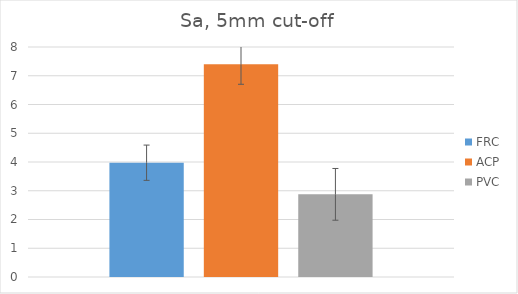
| Category | FRC | ACP | PVC |
|---|---|---|---|
| 0 | 3.975 | 7.4 | 2.875 |